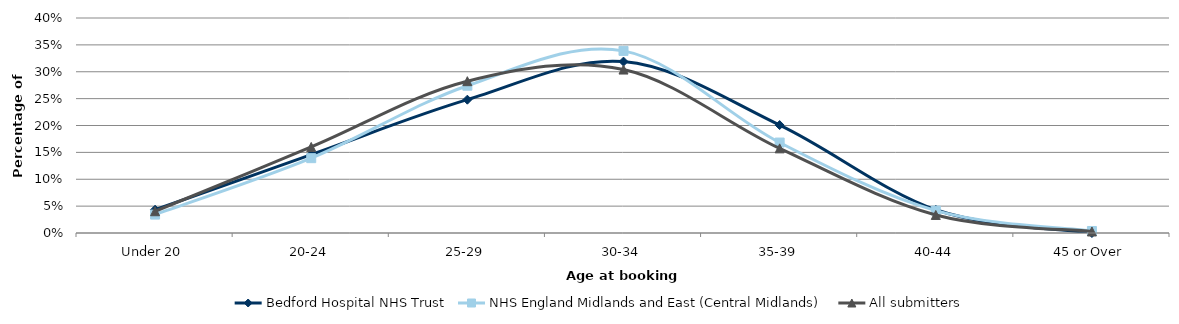
| Category | Bedford Hospital NHS Trust | NHS England Midlands and East (Central Midlands) | All submitters |
|---|---|---|---|
| Under 20 | 0.043 | 0.034 | 0.04 |
| 20-24 | 0.146 | 0.139 | 0.16 |
| 25-29 | 0.248 | 0.274 | 0.282 |
| 30-34 | 0.319 | 0.339 | 0.304 |
| 35-39 | 0.201 | 0.168 | 0.157 |
| 40-44 | 0.043 | 0.042 | 0.034 |
| 45 or Over | 0 | 0.004 | 0.003 |